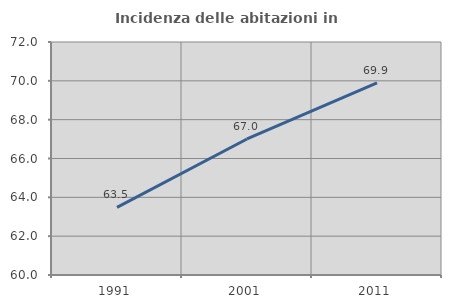
| Category | Incidenza delle abitazioni in proprietà  |
|---|---|
| 1991.0 | 63.485 |
| 2001.0 | 67.006 |
| 2011.0 | 69.9 |